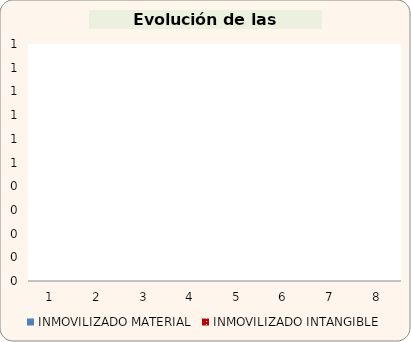
| Category | INMOVILIZADO MATERIAL | INMOVILIZADO INTANGIBLE |
|---|---|---|
| 0 | 0 | 0 |
| 1 | 0 | 0 |
| 2 | 0 | 0 |
| 3 | 0 | 0 |
| 4 | 0 | 0 |
| 5 | 0 | 0 |
| 6 | 0 | 0 |
| 7 | 0 | 0 |